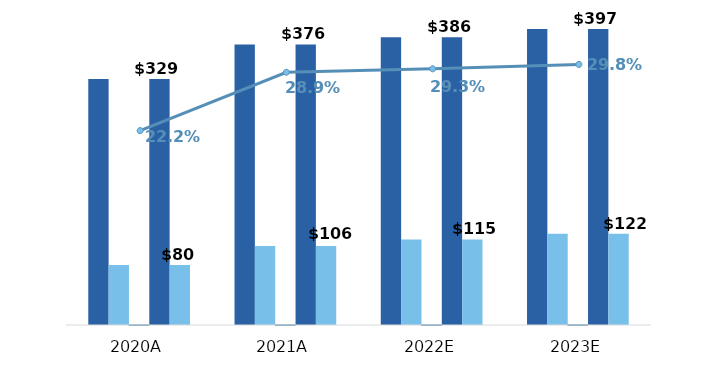
| Category | Funeral Revenue | Cemetery Revenue | Margin % |
|---|---|---|---|
| 2020.0 | 329.448 | 80.31 | 0.222 |
| 2021.0 | 375.886 | 105.799 | 0.289 |
| 2022.0 | 385.565 | 114.614 | 0.293 |
| 2023.0 | 396.626 | 122.34 | 0.298 |